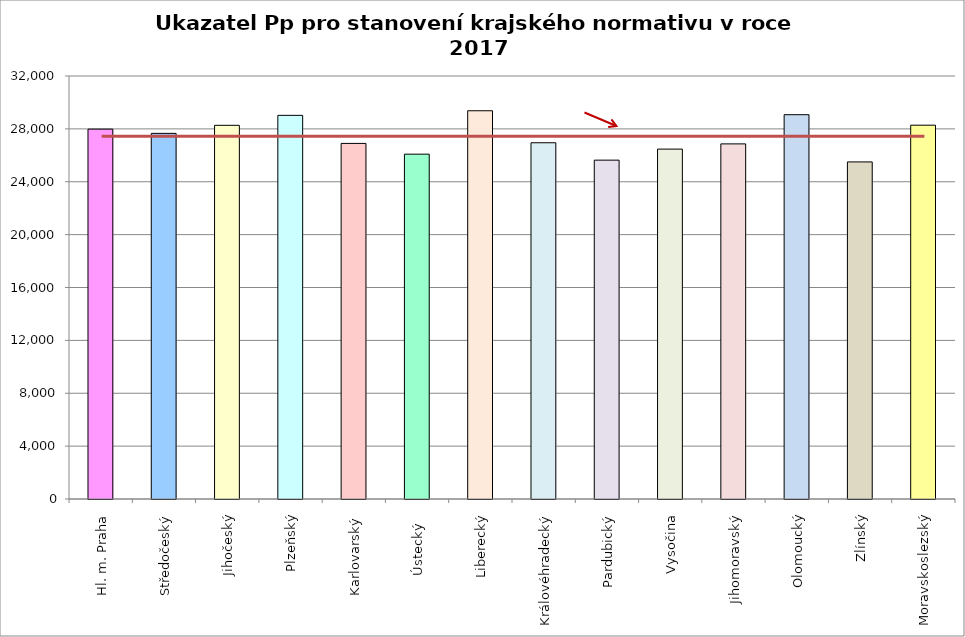
| Category | Series 0 |
|---|---|
| Hl. m. Praha | 27980 |
| Středočeský | 27660 |
| Jihočeský | 28269 |
| Plzeňský | 29023 |
| Karlovarský  | 26900 |
| Ústecký   | 26087 |
| Liberecký | 29370 |
| Královéhradecký | 26950 |
| Pardubický | 25634 |
| Vysočina | 26470 |
| Jihomoravský | 26865 |
| Olomoucký | 29073 |
| Zlínský | 25501 |
| Moravskoslezský | 28280 |